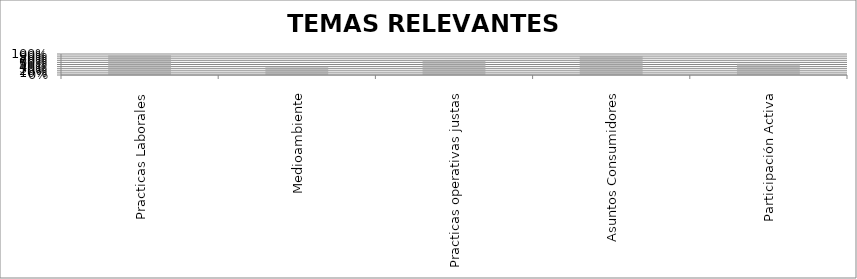
| Category | TEMAS RELEVANTES |
|---|---|
| Practicas Laborales | 0.938 |
| Medioambiente | 0.364 |
| Practicas operativas justas | 0.667 |
| Asuntos Consumidores | 0.909 |
| Participación Activa | 0.541 |